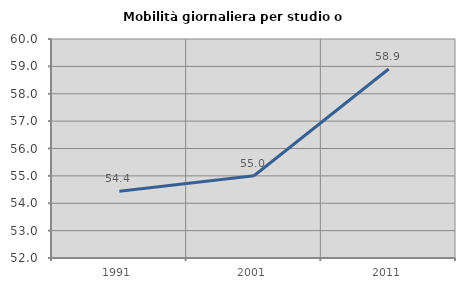
| Category | Mobilità giornaliera per studio o lavoro |
|---|---|
| 1991.0 | 54.442 |
| 2001.0 | 55.003 |
| 2011.0 | 58.903 |